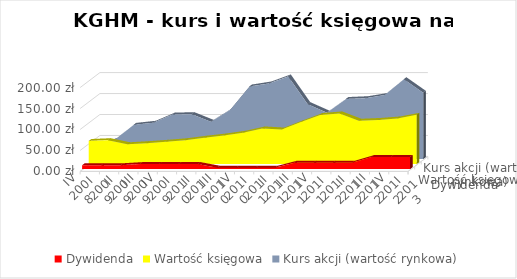
| Category | Dywidenda | Wartość księgowa | Kurs akcji (wartość rynkowa) |
|---|---|---|---|
| IV 2008 | 9 | 54.914 | 28.12 |
| I 2009 | 9 | 56.765 | 45.69 |
| II 2009 | 9 | 47.079 | 81.5 |
| III 2009 | 11.68 | 49.727 | 86.4 |
| IV 2009 | 11.68 | 53.012 | 106 |
| I 2010 | 11.68 | 56.873 | 106.9 |
| II 2010 | 11.68 | 62.847 | 88.6 |
| III 2010 | 3 | 68.044 | 117.3 |
| IV 2010 | 3 | 74.611 | 173 |
| I 2011 | 3 | 84.778 | 180.2 |
| II 2011 | 3 | 82.14 | 197 |
| III 2011 | 14.9 | 99.974 | 131 |
| IV 2011 | 14.9 | 116.912 | 110.6 |
| I 2012 | 14.9 | 120.624 | 143.1 |
| II 2012 | 14.9 | 103.129 | 145 |
| III 2012 | 28.34 | 105.089 | 152.5 |
| IV 2012 | 28.34 | 108.55 | 190 |
| I 2013 | 28.34 | 117.3 | 157.8 |